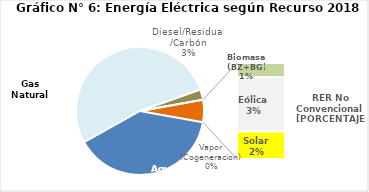
| Category | Series 0 |
|---|---|
| Agua | 1747.143 |
| Gas Natural | 2353 |
| Diesel/Residual/Carbón | 117.281 |
| Vapor (Cogeneracion) | 0.459 |
| Biomasa (BZ+BG) | 37.174 |
| Eólica | 142.482 |
| Solar | 71.771 |